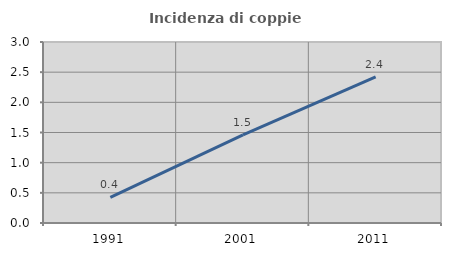
| Category | Incidenza di coppie miste |
|---|---|
| 1991.0 | 0.423 |
| 2001.0 | 1.461 |
| 2011.0 | 2.424 |